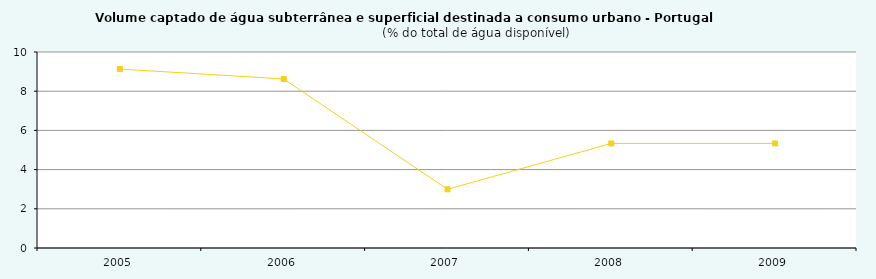
| Category | Series 0 |
|---|---|
| 2005.0 | 9.13 |
| 2006.0 | 8.625 |
| 2007.0 | 2.996 |
| 2008.0 | 5.335 |
| 2009.0 | 5.335 |